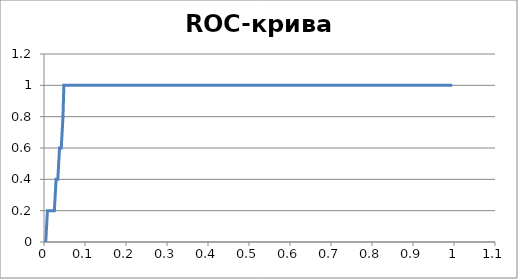
| Category | Чувствительность |
|---|---|
| 0.0 | 0 |
| 0.0 | 0 |
| 0.002105263157894721 | 0 |
| 0.004210526315789442 | 0 |
| 0.0063157894736841635 | 0 |
| 0.008421052631578996 | 0.2 |
| 0.010526315789473717 | 0.2 |
| 0.010526315789473717 | 0.2 |
| 0.012631578947368438 | 0.2 |
| 0.01473684210526316 | 0.2 |
| 0.01684210526315788 | 0.2 |
| 0.0189473684210526 | 0.2 |
| 0.021052631578947323 | 0.2 |
| 0.023157894736842155 | 0.2 |
| 0.025263157894736876 | 0.2 |
| 0.027368421052631597 | 0.2 |
| 0.02947368421052632 | 0.4 |
| 0.03157894736842104 | 0.4 |
| 0.03157894736842104 | 0.4 |
| 0.03368421052631576 | 0.4 |
| 0.03578947368421048 | 0.4 |
| 0.037894736842105314 | 0.6 |
| 0.040000000000000036 | 0.6 |
| 0.040000000000000036 | 0.6 |
| 0.04210526315789476 | 0.6 |
| 0.04421052631578948 | 0.6 |
| 0.0463157894736842 | 0.8 |
| 0.04842105263157892 | 0.8 |
| 0.04842105263157892 | 1 |
| 0.05052631578947364 | 1 |
| 0.05052631578947364 | 1 |
| 0.052631578947368474 | 1 |
| 0.054736842105263195 | 1 |
| 0.056842105263157916 | 1 |
| 0.05894736842105264 | 1 |
| 0.06105263157894736 | 1 |
| 0.06315789473684208 | 1 |
| 0.0652631578947368 | 1 |
| 0.06736842105263163 | 1 |
| 0.06947368421052635 | 1 |
| 0.07157894736842108 | 1 |
| 0.0736842105263158 | 1 |
| 0.07578947368421052 | 1 |
| 0.07789473684210524 | 1 |
| 0.07999999999999996 | 1 |
| 0.08210526315789479 | 1 |
| 0.08421052631578951 | 1 |
| 0.08631578947368423 | 1 |
| 0.08842105263157896 | 1 |
| 0.09052631578947368 | 1 |
| 0.0926315789473684 | 1 |
| 0.09473684210526312 | 1 |
| 0.09684210526315784 | 1 |
| 0.09894736842105267 | 1 |
| 0.1010526315789474 | 1 |
| 0.10315789473684212 | 1 |
| 0.10526315789473684 | 1 |
| 0.10736842105263156 | 1 |
| 0.10947368421052628 | 1 |
| 0.111578947368421 | 1 |
| 0.11368421052631583 | 1 |
| 0.11578947368421055 | 1 |
| 0.11789473684210527 | 1 |
| 0.12 | 1 |
| 0.12210526315789472 | 1 |
| 0.12421052631578944 | 1 |
| 0.12631578947368416 | 1 |
| 0.128421052631579 | 1 |
| 0.1305263157894737 | 1 |
| 0.13263157894736843 | 1 |
| 0.13473684210526315 | 1 |
| 0.13684210526315788 | 1 |
| 0.1389473684210526 | 1 |
| 0.14105263157894732 | 1 |
| 0.14315789473684215 | 1 |
| 0.14526315789473687 | 1 |
| 0.1473684210526316 | 1 |
| 0.14947368421052631 | 1 |
| 0.15157894736842104 | 1 |
| 0.15368421052631576 | 1 |
| 0.15578947368421048 | 1 |
| 0.1578947368421053 | 1 |
| 0.16000000000000003 | 1 |
| 0.16210526315789475 | 1 |
| 0.16421052631578947 | 1 |
| 0.1663157894736842 | 1 |
| 0.16842105263157892 | 1 |
| 0.17052631578947364 | 1 |
| 0.17263157894736847 | 1 |
| 0.1747368421052632 | 1 |
| 0.1768421052631579 | 1 |
| 0.17894736842105263 | 1 |
| 0.18105263157894735 | 1 |
| 0.18315789473684208 | 1 |
| 0.1852631578947368 | 1 |
| 0.18736842105263163 | 1 |
| 0.18947368421052635 | 1 |
| 0.19157894736842107 | 1 |
| 0.1936842105263158 | 1 |
| 0.1957894736842105 | 1 |
| 0.19789473684210523 | 1 |
| 0.19999999999999996 | 1 |
| 0.2021052631578948 | 1 |
| 0.2042105263157895 | 1 |
| 0.20631578947368423 | 1 |
| 0.20842105263157895 | 1 |
| 0.21052631578947367 | 1 |
| 0.2126315789473684 | 1 |
| 0.21473684210526311 | 1 |
| 0.21684210526315795 | 1 |
| 0.21894736842105267 | 1 |
| 0.2210526315789474 | 1 |
| 0.2231578947368421 | 1 |
| 0.22526315789473683 | 1 |
| 0.22736842105263155 | 1 |
| 0.22947368421052627 | 1 |
| 0.2315789473684211 | 1 |
| 0.23368421052631583 | 1 |
| 0.23578947368421055 | 1 |
| 0.23789473684210527 | 1 |
| 0.24 | 1 |
| 0.2421052631578947 | 1 |
| 0.24421052631578943 | 1 |
| 0.24631578947368427 | 1 |
| 0.248421052631579 | 1 |
| 0.2505263157894737 | 1 |
| 0.25263157894736843 | 1 |
| 0.25473684210526315 | 1 |
| 0.25684210526315787 | 1 |
| 0.2589473684210526 | 1 |
| 0.2610526315789473 | 1 |
| 0.26315789473684215 | 1 |
| 0.26526315789473687 | 1 |
| 0.2673684210526316 | 1 |
| 0.2694736842105263 | 1 |
| 0.27157894736842103 | 1 |
| 0.27368421052631575 | 1 |
| 0.2757894736842105 | 1 |
| 0.2778947368421053 | 1 |
| 0.28 | 1 |
| 0.28210526315789475 | 1 |
| 0.28421052631578947 | 1 |
| 0.2863157894736842 | 1 |
| 0.2884210526315789 | 1 |
| 0.29052631578947363 | 1 |
| 0.29263157894736846 | 1 |
| 0.2947368421052632 | 1 |
| 0.2968421052631579 | 1 |
| 0.29894736842105263 | 1 |
| 0.30105263157894735 | 1 |
| 0.30315789473684207 | 1 |
| 0.3052631578947368 | 1 |
| 0.3073684210526316 | 1 |
| 0.30947368421052635 | 1 |
| 0.31157894736842107 | 1 |
| 0.3136842105263158 | 1 |
| 0.3157894736842105 | 1 |
| 0.31789473684210523 | 1 |
| 0.31999999999999995 | 1 |
| 0.3221052631578948 | 1 |
| 0.3242105263157895 | 1 |
| 0.3263157894736842 | 1 |
| 0.32842105263157895 | 1 |
| 0.33052631578947367 | 1 |
| 0.3326315789473684 | 1 |
| 0.3347368421052631 | 1 |
| 0.33684210526315794 | 1 |
| 0.33894736842105266 | 1 |
| 0.3410526315789474 | 1 |
| 0.3431578947368421 | 1 |
| 0.3452631578947368 | 1 |
| 0.34736842105263155 | 1 |
| 0.34947368421052627 | 1 |
| 0.3515789473684211 | 1 |
| 0.3536842105263158 | 1 |
| 0.35578947368421054 | 1 |
| 0.35789473684210527 | 1 |
| 0.36 | 1 |
| 0.3621052631578947 | 1 |
| 0.36421052631578943 | 1 |
| 0.36631578947368426 | 1 |
| 0.368421052631579 | 1 |
| 0.3705263157894737 | 1 |
| 0.3726315789473684 | 1 |
| 0.37473684210526315 | 1 |
| 0.37684210526315787 | 1 |
| 0.3789473684210526 | 1 |
| 0.3810526315789474 | 1 |
| 0.38315789473684214 | 1 |
| 0.38526315789473686 | 1 |
| 0.3873684210526316 | 1 |
| 0.3894736842105263 | 1 |
| 0.391578947368421 | 1 |
| 0.39368421052631575 | 1 |
| 0.3957894736842106 | 1 |
| 0.3978947368421053 | 1 |
| 0.4 | 1 |
| 0.40210526315789474 | 1 |
| 0.40421052631578946 | 1 |
| 0.4063157894736842 | 1 |
| 0.4084210526315789 | 1 |
| 0.41052631578947374 | 1 |
| 0.41263157894736846 | 1 |
| 0.4147368421052632 | 1 |
| 0.4168421052631579 | 1 |
| 0.4189473684210526 | 1 |
| 0.42105263157894735 | 1 |
| 0.42315789473684207 | 1 |
| 0.4252631578947368 | 1 |
| 0.4273684210526316 | 1 |
| 0.42947368421052634 | 1 |
| 0.43157894736842106 | 1 |
| 0.4336842105263158 | 1 |
| 0.4357894736842105 | 1 |
| 0.4378947368421052 | 1 |
| 0.43999999999999995 | 1 |
| 0.4421052631578948 | 1 |
| 0.4442105263157895 | 1 |
| 0.4463157894736842 | 1 |
| 0.44842105263157894 | 1 |
| 0.45052631578947366 | 1 |
| 0.4526315789473684 | 1 |
| 0.4547368421052631 | 1 |
| 0.45684210526315794 | 1 |
| 0.45894736842105266 | 1 |
| 0.4610526315789474 | 1 |
| 0.4631578947368421 | 1 |
| 0.4652631578947368 | 1 |
| 0.46736842105263154 | 1 |
| 0.46947368421052627 | 1 |
| 0.4715789473684211 | 1 |
| 0.4736842105263158 | 1 |
| 0.47578947368421054 | 1 |
| 0.47789473684210526 | 1 |
| 0.48 | 1 |
| 0.4821052631578947 | 1 |
| 0.4842105263157894 | 1 |
| 0.48631578947368426 | 1 |
| 0.488421052631579 | 1 |
| 0.4905263157894737 | 1 |
| 0.4926315789473684 | 1 |
| 0.49473684210526314 | 1 |
| 0.49684210526315786 | 1 |
| 0.4989473684210526 | 1 |
| 0.5010526315789474 | 1 |
| 0.503157894736842 | 1 |
| 0.5052631578947369 | 1 |
| 0.5073684210526316 | 1 |
| 0.5094736842105263 | 1 |
| 0.5115789473684211 | 1 |
| 0.5136842105263157 | 1 |
| 0.5157894736842106 | 1 |
| 0.5178947368421052 | 1 |
| 0.52 | 1 |
| 0.5221052631578947 | 1 |
| 0.5242105263157895 | 1 |
| 0.5263157894736843 | 1 |
| 0.5284210526315789 | 1 |
| 0.5305263157894737 | 1 |
| 0.5326315789473683 | 1 |
| 0.5347368421052632 | 1 |
| 0.5368421052631579 | 1 |
| 0.5389473684210526 | 1 |
| 0.5410526315789475 | 1 |
| 0.5431578947368421 | 1 |
| 0.5452631578947369 | 1 |
| 0.5473684210526315 | 1 |
| 0.5494736842105263 | 1 |
| 0.5515789473684211 | 1 |
| 0.5536842105263158 | 1 |
| 0.5557894736842105 | 1 |
| 0.5578947368421052 | 1 |
| 0.56 | 1 |
| 0.5621052631578947 | 1 |
| 0.5642105263157895 | 1 |
| 0.5663157894736842 | 1 |
| 0.5684210526315789 | 1 |
| 0.5705263157894737 | 1 |
| 0.5726315789473684 | 1 |
| 0.5747368421052632 | 1 |
| 0.5768421052631578 | 1 |
| 0.5789473684210527 | 1 |
| 0.5810526315789474 | 1 |
| 0.5831578947368421 | 1 |
| 0.5852631578947368 | 1 |
| 0.5873684210526315 | 1 |
| 0.5894736842105264 | 1 |
| 0.591578947368421 | 1 |
| 0.5936842105263158 | 1 |
| 0.5957894736842105 | 1 |
| 0.5978947368421053 | 1 |
| 0.6 | 1 |
| 0.6021052631578947 | 1 |
| 0.6042105263157895 | 1 |
| 0.6063157894736841 | 1 |
| 0.608421052631579 | 1 |
| 0.6105263157894737 | 1 |
| 0.6126315789473684 | 1 |
| 0.6147368421052631 | 1 |
| 0.6168421052631579 | 1 |
| 0.6189473684210527 | 1 |
| 0.6210526315789473 | 1 |
| 0.6231578947368421 | 1 |
| 0.6252631578947369 | 1 |
| 0.6273684210526316 | 1 |
| 0.6294736842105263 | 1 |
| 0.631578947368421 | 1 |
| 0.6336842105263158 | 1 |
| 0.6357894736842105 | 1 |
| 0.6378947368421053 | 1 |
| 0.64 | 1 |
| 0.6421052631578947 | 1 |
| 0.6442105263157895 | 1 |
| 0.6463157894736842 | 1 |
| 0.648421052631579 | 1 |
| 0.6505263157894736 | 1 |
| 0.6526315789473685 | 1 |
| 0.6547368421052632 | 1 |
| 0.6568421052631579 | 1 |
| 0.6589473684210526 | 1 |
| 0.6610526315789473 | 1 |
| 0.6631578947368422 | 1 |
| 0.6652631578947368 | 1 |
| 0.6673684210526316 | 1 |
| 0.6694736842105263 | 1 |
| 0.671578947368421 | 1 |
| 0.6736842105263158 | 1 |
| 0.6757894736842105 | 1 |
| 0.6778947368421053 | 1 |
| 0.6799999999999999 | 1 |
| 0.6821052631578948 | 1 |
| 0.6842105263157895 | 1 |
| 0.6863157894736842 | 1 |
| 0.6884210526315789 | 1 |
| 0.6905263157894737 | 1 |
| 0.6926315789473685 | 1 |
| 0.6947368421052631 | 1 |
| 0.6968421052631579 | 1 |
| 0.6989473684210527 | 1 |
| 0.7010526315789474 | 1 |
| 0.7031578947368421 | 1 |
| 0.7052631578947368 | 1 |
| 0.7073684210526316 | 1 |
| 0.7094736842105263 | 1 |
| 0.7115789473684211 | 1 |
| 0.7136842105263158 | 1 |
| 0.7157894736842105 | 1 |
| 0.7178947368421053 | 1 |
| 0.72 | 1 |
| 0.7221052631578948 | 1 |
| 0.7242105263157894 | 1 |
| 0.7263157894736842 | 1 |
| 0.728421052631579 | 1 |
| 0.7305263157894737 | 1 |
| 0.7326315789473684 | 1 |
| 0.7347368421052631 | 1 |
| 0.736842105263158 | 1 |
| 0.7389473684210526 | 1 |
| 0.7410526315789474 | 1 |
| 0.7431578947368421 | 1 |
| 0.7452631578947368 | 1 |
| 0.7473684210526316 | 1 |
| 0.7494736842105263 | 1 |
| 0.751578947368421 | 1 |
| 0.7536842105263157 | 1 |
| 0.7557894736842106 | 1 |
| 0.7578947368421053 | 1 |
| 0.76 | 1 |
| 0.7621052631578947 | 1 |
| 0.7642105263157895 | 1 |
| 0.7663157894736842 | 1 |
| 0.7684210526315789 | 1 |
| 0.7705263157894737 | 1 |
| 0.7726315789473684 | 1 |
| 0.7747368421052632 | 1 |
| 0.7768421052631579 | 1 |
| 0.7789473684210526 | 1 |
| 0.7810526315789473 | 1 |
| 0.783157894736842 | 1 |
| 0.7852631578947369 | 1 |
| 0.7873684210526316 | 1 |
| 0.7894736842105263 | 1 |
| 0.791578947368421 | 1 |
| 0.7936842105263158 | 1 |
| 0.7957894736842105 | 1 |
| 0.7978947368421052 | 1 |
| 0.8 | 1 |
| 0.8021052631578948 | 1 |
| 0.8042105263157895 | 1 |
| 0.8063157894736842 | 1 |
| 0.8084210526315789 | 1 |
| 0.8105263157894737 | 1 |
| 0.8126315789473684 | 1 |
| 0.8147368421052632 | 1 |
| 0.8168421052631579 | 1 |
| 0.8189473684210526 | 1 |
| 0.8210526315789474 | 1 |
| 0.8231578947368421 | 1 |
| 0.8252631578947368 | 1 |
| 0.8273684210526315 | 1 |
| 0.8294736842105264 | 1 |
| 0.8315789473684211 | 1 |
| 0.8336842105263158 | 1 |
| 0.8357894736842105 | 1 |
| 0.8378947368421052 | 1 |
| 0.84 | 1 |
| 0.8421052631578947 | 1 |
| 0.8442105263157895 | 1 |
| 0.8463157894736842 | 1 |
| 0.848421052631579 | 1 |
| 0.8505263157894737 | 1 |
| 0.8526315789473684 | 1 |
| 0.8547368421052631 | 1 |
| 0.8568421052631578 | 1 |
| 0.8589473684210527 | 1 |
| 0.8610526315789474 | 1 |
| 0.8631578947368421 | 1 |
| 0.8652631578947368 | 1 |
| 0.8673684210526316 | 1 |
| 0.8694736842105263 | 1 |
| 0.871578947368421 | 1 |
| 0.8736842105263158 | 1 |
| 0.8757894736842106 | 1 |
| 0.8778947368421053 | 1 |
| 0.88 | 1 |
| 0.8821052631578947 | 1 |
| 0.8842105263157894 | 1 |
| 0.8863157894736842 | 1 |
| 0.888421052631579 | 1 |
| 0.8905263157894737 | 1 |
| 0.8926315789473684 | 1 |
| 0.8947368421052632 | 1 |
| 0.8968421052631579 | 1 |
| 0.8989473684210526 | 1 |
| 0.9010526315789473 | 1 |
| 0.9031578947368422 | 1 |
| 0.9052631578947369 | 1 |
| 0.9073684210526316 | 1 |
| 0.9094736842105263 | 1 |
| 0.911578947368421 | 1 |
| 0.9136842105263158 | 1 |
| 0.9157894736842105 | 1 |
| 0.9178947368421053 | 1 |
| 0.92 | 1 |
| 0.9221052631578948 | 1 |
| 0.9242105263157895 | 1 |
| 0.9263157894736842 | 1 |
| 0.9284210526315789 | 1 |
| 0.9305263157894736 | 1 |
| 0.9326315789473685 | 1 |
| 0.9347368421052632 | 1 |
| 0.9368421052631579 | 1 |
| 0.9389473684210526 | 1 |
| 0.9410526315789474 | 1 |
| 0.9431578947368421 | 1 |
| 0.9452631578947368 | 1 |
| 0.9473684210526316 | 1 |
| 0.9494736842105264 | 1 |
| 0.9515789473684211 | 1 |
| 0.9536842105263158 | 1 |
| 0.9557894736842105 | 1 |
| 0.9578947368421052 | 1 |
| 0.96 | 1 |
| 0.9621052631578947 | 1 |
| 0.9642105263157895 | 1 |
| 0.9663157894736842 | 1 |
| 0.968421052631579 | 1 |
| 0.9705263157894737 | 1 |
| 0.9726315789473684 | 1 |
| 0.9747368421052631 | 1 |
| 0.9768421052631578 | 1 |
| 0.9789473684210527 | 1 |
| 0.9810526315789474 | 1 |
| 0.9831578947368421 | 1 |
| 0.9852631578947368 | 1 |
| 0.9873684210526316 | 1 |
| 0.9894736842105263 | 1 |
| 0.991578947368421 | 1 |
| 0.9936842105263158 | 1 |
| 0.9957894736842106 | 1 |